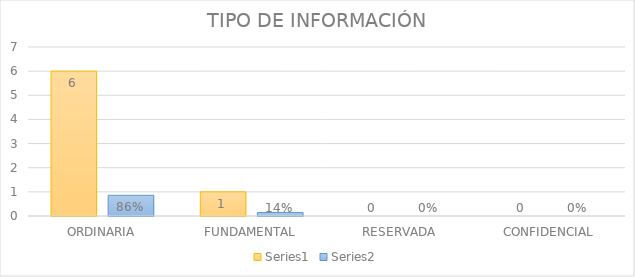
| Category | Series 3 | Series 4 |
|---|---|---|
| ORDINARIA | 6 | 0.857 |
| FUNDAMENTAL | 1 | 0.143 |
| RESERVADA | 0 | 0 |
| CONFIDENCIAL | 0 | 0 |